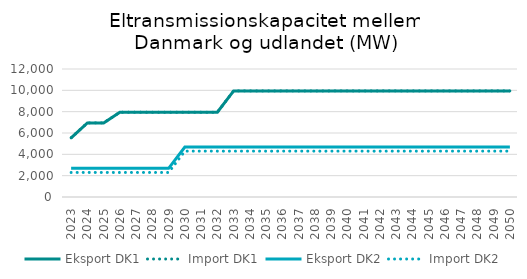
| Category | Eksport DK1 | Import DK1 | Eksport DK2 | Import DK2 |
|---|---|---|---|---|
| 2023.0 | 5547 | 5547 | 2685 | 2300 |
| 2024.0 | 6947 | 6947 | 2685 | 2300 |
| 2025.0 | 6947 | 6947 | 2685 | 2300 |
| 2026.0 | 7947 | 7947 | 2685 | 2300 |
| 2027.0 | 7947 | 7947 | 2685 | 2300 |
| 2028.0 | 7947 | 7947 | 2685 | 2300 |
| 2029.0 | 7947 | 7947 | 2685 | 2300 |
| 2030.0 | 7947 | 7947 | 4685 | 4300 |
| 2031.0 | 7947 | 7947 | 4685 | 4300 |
| 2032.0 | 7947 | 7947 | 4685 | 4300 |
| 2033.0 | 9947 | 9947 | 4685 | 4300 |
| 2034.0 | 9947 | 9947 | 4685 | 4300 |
| 2035.0 | 9947 | 9947 | 4685 | 4300 |
| 2036.0 | 9947 | 9947 | 4685 | 4300 |
| 2037.0 | 9947 | 9947 | 4685 | 4300 |
| 2038.0 | 9947 | 9947 | 4685 | 4300 |
| 2039.0 | 9947 | 9947 | 4685 | 4300 |
| 2040.0 | 9947 | 9947 | 4685 | 4300 |
| 2041.0 | 9947 | 9947 | 4685 | 4300 |
| 2042.0 | 9947 | 9947 | 4685 | 4300 |
| 2043.0 | 9947 | 9947 | 4685 | 4300 |
| 2044.0 | 9947 | 9947 | 4685 | 4300 |
| 2045.0 | 9947 | 9947 | 4685 | 4300 |
| 2046.0 | 9947 | 9947 | 4685 | 4300 |
| 2047.0 | 9947 | 9947 | 4685 | 4300 |
| 2048.0 | 9947 | 9947 | 4685 | 4300 |
| 2049.0 | 9947 | 9947 | 4685 | 4300 |
| 2050.0 | 9947 | 9947 | 4685 | 4300 |